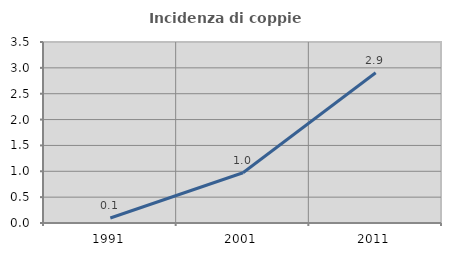
| Category | Incidenza di coppie miste |
|---|---|
| 1991.0 | 0.097 |
| 2001.0 | 0.971 |
| 2011.0 | 2.905 |